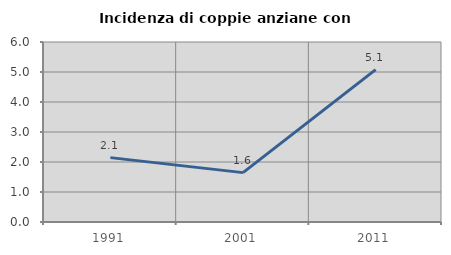
| Category | Incidenza di coppie anziane con figli |
|---|---|
| 1991.0 | 2.146 |
| 2001.0 | 1.646 |
| 2011.0 | 5.079 |